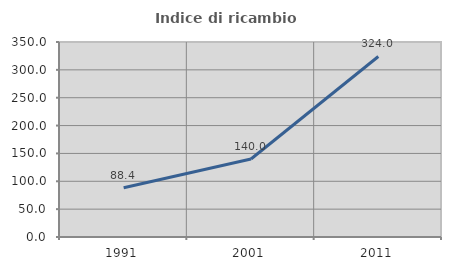
| Category | Indice di ricambio occupazionale  |
|---|---|
| 1991.0 | 88.372 |
| 2001.0 | 140 |
| 2011.0 | 324 |